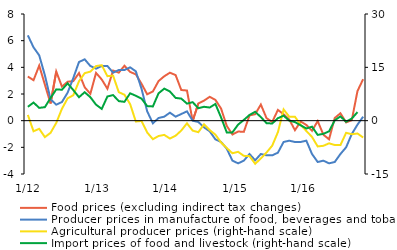
| Category | Food prices (excluding indirect tax changes) | Producer prices in manufacture of food, beverages and tobacco  |
|---|---|---|
|  1/12 | 3.311 | 6.4 |
| 2 | 3.036 | 5.5 |
| 3 | 4.13 | 4.9 |
| 4 | 2.702 | 3.4 |
| 5 | 1.287 | 1.6 |
| 6 | 3.686 | 1.2 |
| 7 | 2.554 | 1.4 |
| 8 | 2.92 | 2.1 |
| 9 | 2.967 | 3.2 |
| 10 | 3.572 | 4.4 |
| 11 | 2.506 | 4.6 |
| 12 | 2.015 | 4.1 |
|  1/13 | 3.583 | 3.9 |
| 2 | 3.091 | 4.1 |
| 3 | 2.394 | 4.1 |
| 4 | 3.758 | 3.6 |
| 5 | 3.601 | 3.8 |
| 6 | 4.119 | 3.8 |
| 7 | 3.656 | 4 |
| 8 | 3.475 | 3.7 |
| 9 | 2.771 | 2.4 |
| 10 | 1.976 | 0.7 |
| 11 | 2.189 | -0.2 |
| 12 | 2.971 | 0.2 |
|  1/14 | 3.33 | 0.3 |
| 2 | 3.598 | 0.6 |
| 3 | 3.419 | 0.3 |
| 4 | 2.299 | 0.5 |
| 5 | 2.261 | 0.7 |
| 6 | -0.023 | 0 |
| 7 | 1.287 | -0.1 |
| 8 | 1.502 | -0.5 |
| 9 | 1.79 | -0.8 |
| 10 | 1.558 | -1.4 |
| 11 | 0.908 | -1.6 |
| 12 | -0.394 | -2.1 |
|   1/15 | -1.038 | -3 |
| 2 | -0.812 | -3.2 |
| 3 | -0.84 | -3 |
| 4 | 0.392 | -2.5 |
| 5 | 0.486 | -2.973 |
| 6 | 1.21 | -2.5 |
| 7 | 0.185 | -2.6 |
| 8 | -0.093 | -2.6 |
| 9 | 0.807 | -2.4 |
| 10 | 0.479 | -1.6 |
| 11 | 0.088 | -1.5 |
| 12 | -0.713 | -1.6 |
|   1/16 | -0.062 | -1.6 |
| 2 | -0.32 | -1.5 |
| 3 | -0.762 | -2.5 |
| 4 | -0.032 | -3.1 |
| 5 | -1.052 | -3 |
| 6 | -1.398 | -3.2 |
| 7 | 0.197 | -3.1 |
| 8 | 0.556 | -2.5 |
| 9 | -0.132 | -2 |
| 10 | 0.038 | -1 |
| 11 | 2.22 | -0.3 |
| 12 | 3.112 | 0.3 |